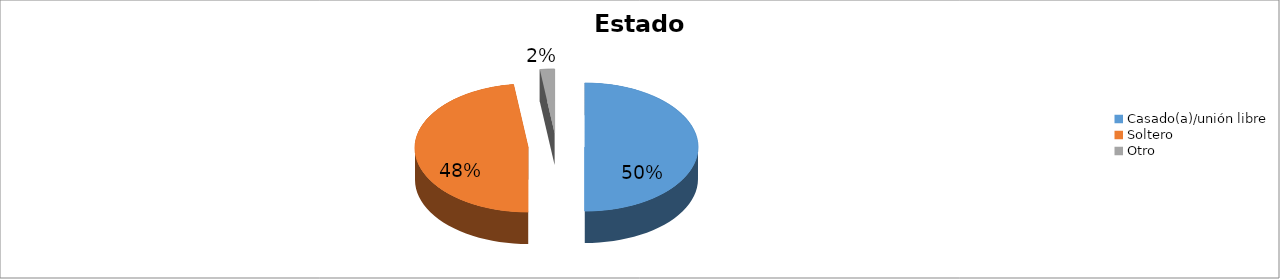
| Category | Series 0 |
|---|---|
| Casado(a)/unión libre | 0.5 |
| Soltero | 0.479 |
| Otro | 0.021 |